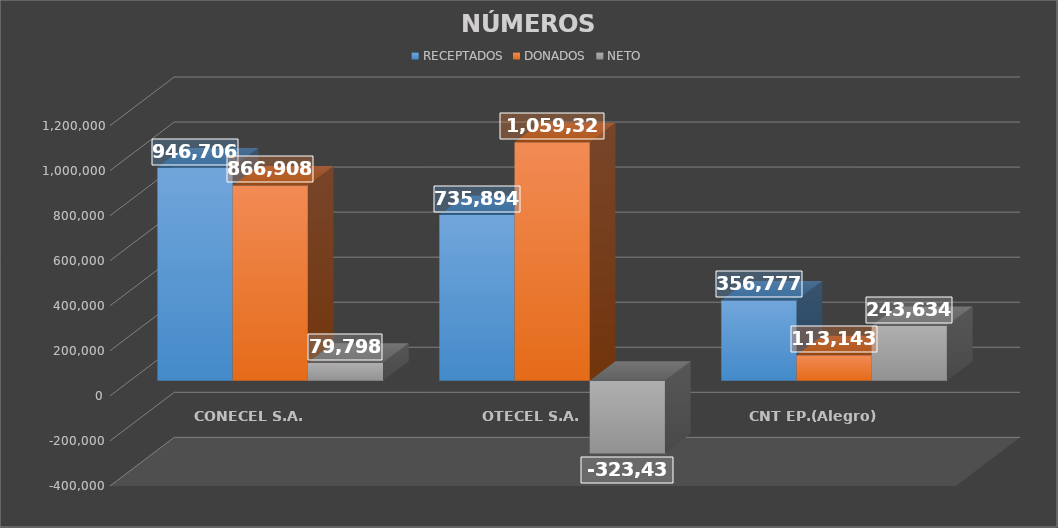
| Category | RECEPTADOS | DONADOS | NETO |
|---|---|---|---|
| CONECEL S.A. | 946706 | 866908 | 79798 |
| OTECEL S.A. | 735894 | 1059326 | -323432 |
| CNT EP.(Alegro) | 356777 | 113143 | 243634 |